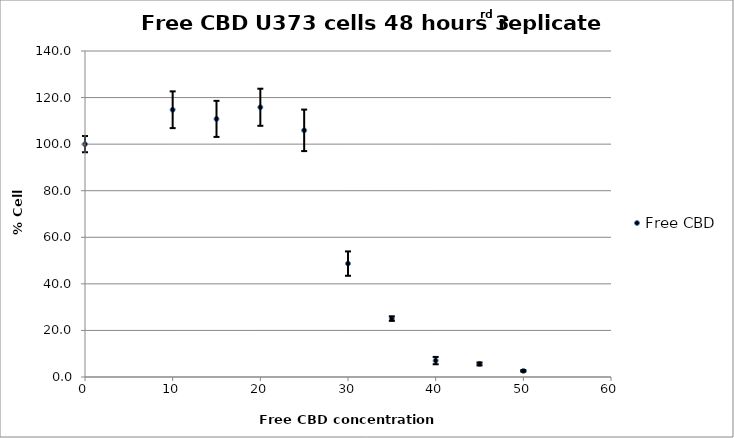
| Category | Free CBD |
|---|---|
| 50.0 | 2.619 |
| 45.0 | 5.613 |
| 40.0 | 7.043 |
| 35.0 | 25.083 |
| 30.0 | 48.701 |
| 25.0 | 105.928 |
| 20.0 | 115.839 |
| 15.0 | 110.847 |
| 10.0 | 114.772 |
| 0.0 | 100 |